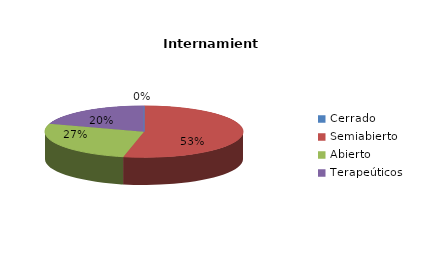
| Category | Series 0 |
|---|---|
| Cerrado | 0 |
| Semiabierto | 8 |
| Abierto | 4 |
| Terapeúticos | 3 |